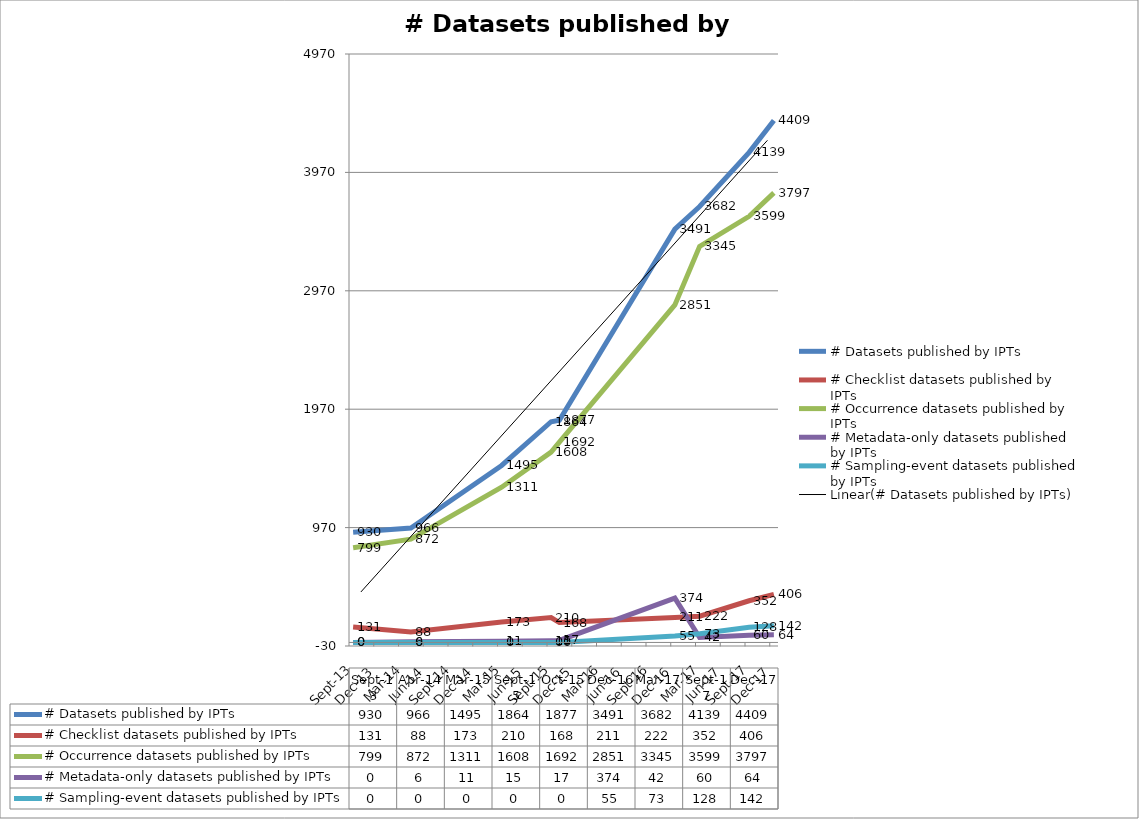
| Category | # Datasets published by IPTs | # Checklist datasets published by IPTs | # Occurrence datasets published by IPTs | # Metadata-only datasets published by IPTs | # Sampling-event datasets published by IPTs |
|---|---|---|---|---|---|
| 2013-09-01 | 930 | 131 | 799 | 0 | 0 |
| 2014-04-01 | 966 | 88 | 872 | 6 | 0 |
| 2015-03-01 | 1495 | 173 | 1311 | 11 | 0 |
| 2015-09-01 | 1864 | 210 | 1608 | 15 | 0 |
| 2015-10-16 | 1877 | 168 | 1692 | 17 | 0 |
| 2016-12-01 | 3491 | 211 | 2851 | 374 | 55 |
| 2017-03-01 | 3682 | 222 | 3345 | 42 | 73 |
| 2017-09-20 | 4139 | 352 | 3599 | 60 | 128 |
| 2017-12-04 | 4409 | 406 | 3797 | 64 | 142 |